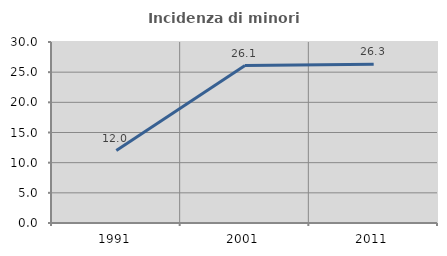
| Category | Incidenza di minori stranieri |
|---|---|
| 1991.0 | 12 |
| 2001.0 | 26.087 |
| 2011.0 | 26.332 |